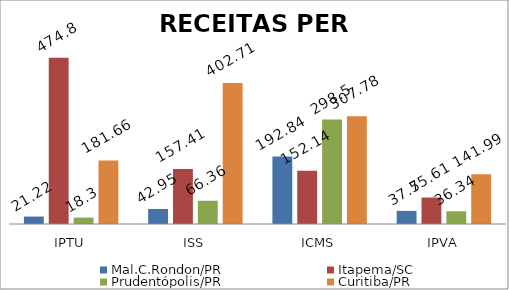
| Category | Mal.C.Rondon/PR | Itapema/SC | Prudentópolis/PR | Toledo/PR | Cascavel/PR | Curitiba/PR |
|---|---|---|---|---|---|---|
| IPTU | 21.22 | 474.8 | 18.3 |  |  | 181.66 |
| ISS | 42.95 | 157.41 | 66.36 |  |  | 402.71 |
| ICMS | 192.84 | 152.14 | 298.5 |  |  | 307.78 |
| IPVA | 37.5 | 75.61 | 36.34 |  |  | 141.99 |